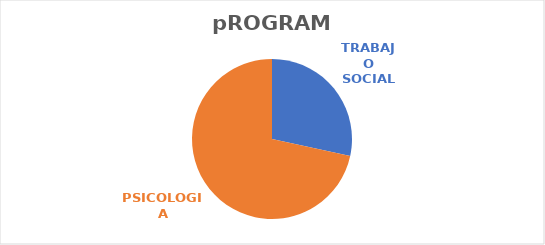
| Category | Series 0 |
|---|---|
| TRABAJO SOCIAL | 23 |
| PSICOLOGIA | 58 |